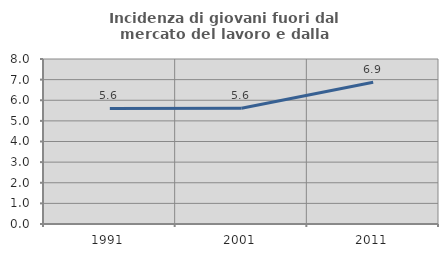
| Category | Incidenza di giovani fuori dal mercato del lavoro e dalla formazione  |
|---|---|
| 1991.0 | 5.603 |
| 2001.0 | 5.607 |
| 2011.0 | 6.875 |